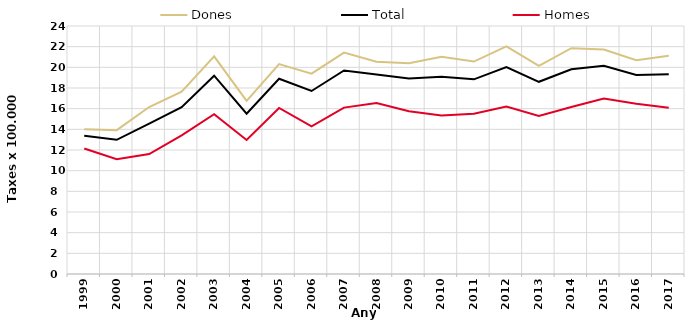
| Category | Dones | Total | Homes |
|---|---|---|---|
| 1999.0 | 14 | 13.39 | 12.15 |
| 2000.0 | 13.92 | 12.99 | 11.1 |
| 2001.0 | 16.16 | 14.56 | 11.61 |
| 2002.0 | 17.64 | 16.15 | 13.42 |
| 2003.0 | 21.06 | 19.19 | 15.46 |
| 2004.0 | 16.75 | 15.52 | 12.97 |
| 2005.0 | 20.32 | 18.9 | 16.07 |
| 2006.0 | 19.39 | 17.71 | 14.29 |
| 2007.0 | 21.42 | 19.7 | 16.1 |
| 2008.0 | 20.54 | 19.31 | 16.55 |
| 2009.0 | 20.4 | 18.93 | 15.75 |
| 2010.0 | 21.03 | 19.08 | 15.35 |
| 2011.0 | 20.56 | 18.84 | 15.51 |
| 2012.0 | 22.02 | 20.02 | 16.2 |
| 2013.0 | 20.15 | 18.6 | 15.3 |
| 2014.0 | 21.85 | 19.82 | 16.16 |
| 2015.0 | 21.72 | 20.15 | 16.98 |
| 2016.0 | 20.69 | 19.26 | 16.47 |
| 2017.0 | 21.11 | 19.32 | 16.09 |